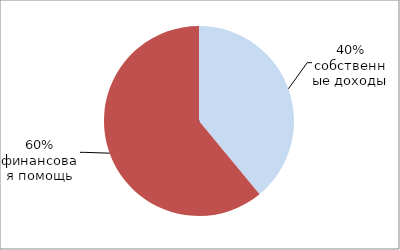
| Category | Series 0 |
|---|---|
| 0 | 0.39 |
| 1 | 0.61 |